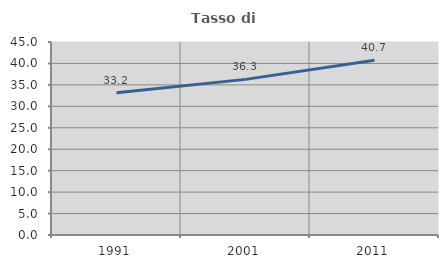
| Category | Tasso di occupazione   |
|---|---|
| 1991.0 | 33.15 |
| 2001.0 | 36.288 |
| 2011.0 | 40.742 |